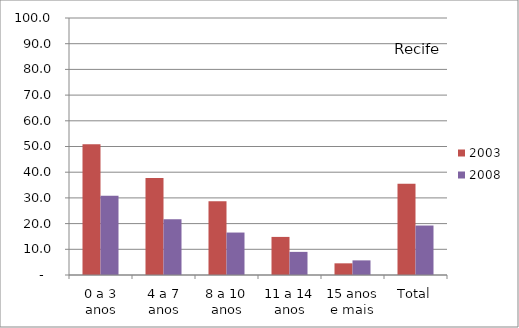
| Category | 2003 | 2008 |
|---|---|---|
| 0 a 3 anos | 50.83 | 30.8 |
| 4 a 7 anos | 37.7 | 21.65 |
| 8 a 10 anos | 28.69 | 16.52 |
| 11 a 14 anos | 14.82 | 9 |
| 15 anos e mais | 4.54 | 5.69 |
| Total | 35.52 | 19.25 |